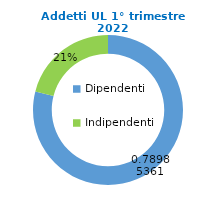
| Category | Series 0 |
|---|---|
| Dipendenti | 82174 |
| Indipendenti | 21863 |